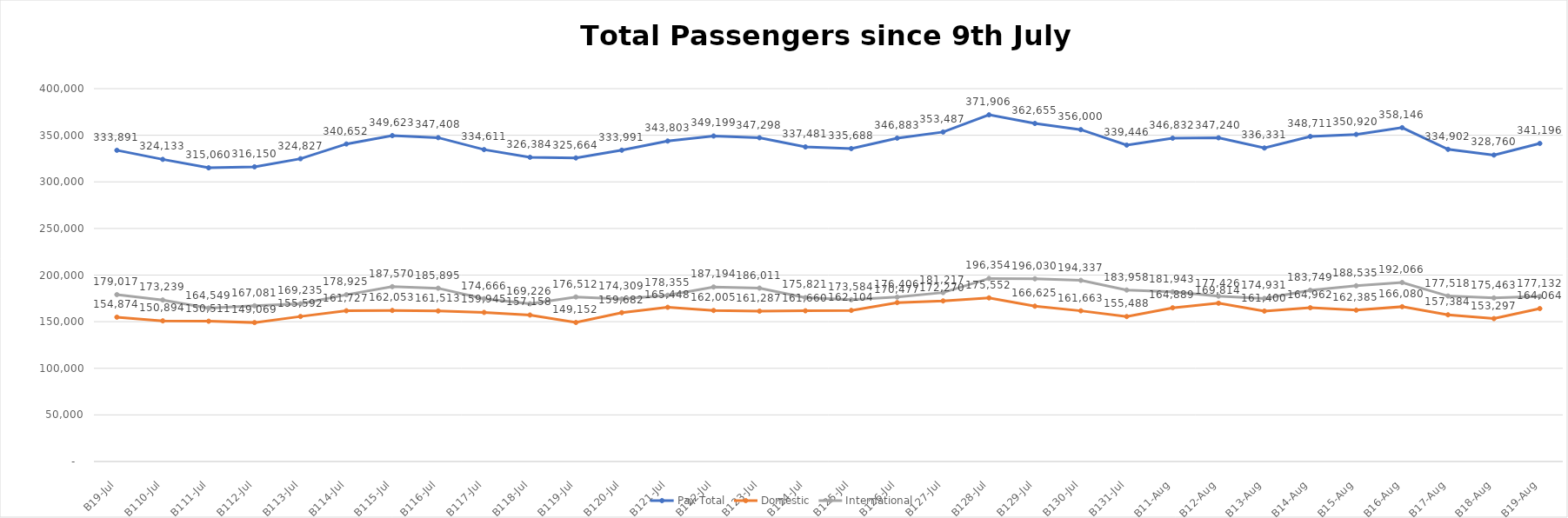
| Category | Pax Total |  Domestic  |  International  |
|---|---|---|---|
| 2023-07-09 | 333891 | 154874 | 179017 |
| 2023-07-10 | 324133 | 150894 | 173239 |
| 2023-07-11 | 315060 | 150511 | 164549 |
| 2023-07-12 | 316150 | 149069 | 167081 |
| 2023-07-13 | 324827 | 155592 | 169235 |
| 2023-07-14 | 340652 | 161727 | 178925 |
| 2023-07-15 | 349623 | 162053 | 187570 |
| 2023-07-16 | 347408 | 161513 | 185895 |
| 2023-07-17 | 334611 | 159945 | 174666 |
| 2023-07-18 | 326384 | 157158 | 169226 |
| 2023-07-19 | 325664 | 149152 | 176512 |
| 2023-07-20 | 333991 | 159682 | 174309 |
| 2023-07-21 | 343803 | 165448 | 178355 |
| 2023-07-22 | 349199 | 162005 | 187194 |
| 2023-07-23 | 347298 | 161287 | 186011 |
| 2023-07-24 | 337481 | 161660 | 175821 |
| 2023-07-25 | 335688 | 162104 | 173584 |
| 2023-07-26 | 346883 | 170477 | 176406 |
| 2023-07-27 | 353487 | 172270 | 181217 |
| 2023-07-28 | 371906 | 175552 | 196354 |
| 2023-07-29 | 362655 | 166625 | 196030 |
| 2023-07-30 | 356000 | 161663 | 194337 |
| 2023-07-31 | 339446 | 155488 | 183958 |
| 2023-08-01 | 346832 | 164889 | 181943 |
| 2023-08-02 | 347240 | 169814 | 177426 |
| 2023-08-03 | 336331 | 161400 | 174931 |
| 2023-08-04 | 348711 | 164962 | 183749 |
| 2023-08-05 | 350920 | 162385 | 188535 |
| 2023-08-06 | 358146 | 166080 | 192066 |
| 2023-08-07 | 334902 | 157384 | 177518 |
| 2023-08-08 | 328760 | 153297 | 175463 |
| 2023-08-09 | 341196 | 164064 | 177132 |